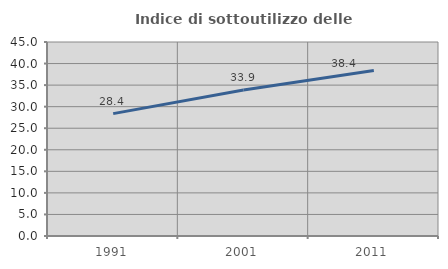
| Category | Indice di sottoutilizzo delle abitazioni  |
|---|---|
| 1991.0 | 28.391 |
| 2001.0 | 33.871 |
| 2011.0 | 38.378 |